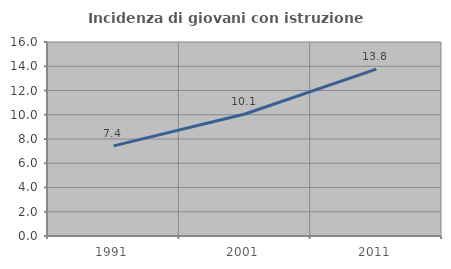
| Category | Incidenza di giovani con istruzione universitaria |
|---|---|
| 1991.0 | 7.432 |
| 2001.0 | 10.063 |
| 2011.0 | 13.768 |